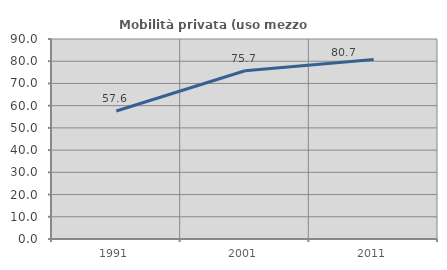
| Category | Mobilità privata (uso mezzo privato) |
|---|---|
| 1991.0 | 57.617 |
| 2001.0 | 75.737 |
| 2011.0 | 80.74 |